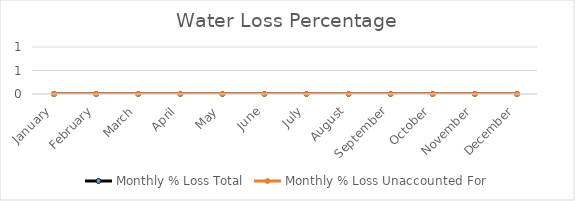
| Category | Monthly % Loss |
|---|---|
| January | 0 |
| February | 0 |
| March | 0 |
| April | 0 |
| May | 0 |
| June | 0 |
| July | 0 |
| August | 0 |
| September | 0 |
| October | 0 |
| November | 0 |
| December | 0 |